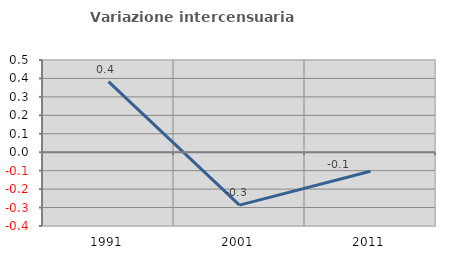
| Category | Variazione intercensuaria annua |
|---|---|
| 1991.0 | 0.383 |
| 2001.0 | -0.287 |
| 2011.0 | -0.103 |